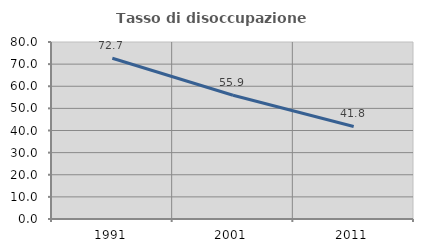
| Category | Tasso di disoccupazione giovanile  |
|---|---|
| 1991.0 | 72.661 |
| 2001.0 | 55.939 |
| 2011.0 | 41.818 |